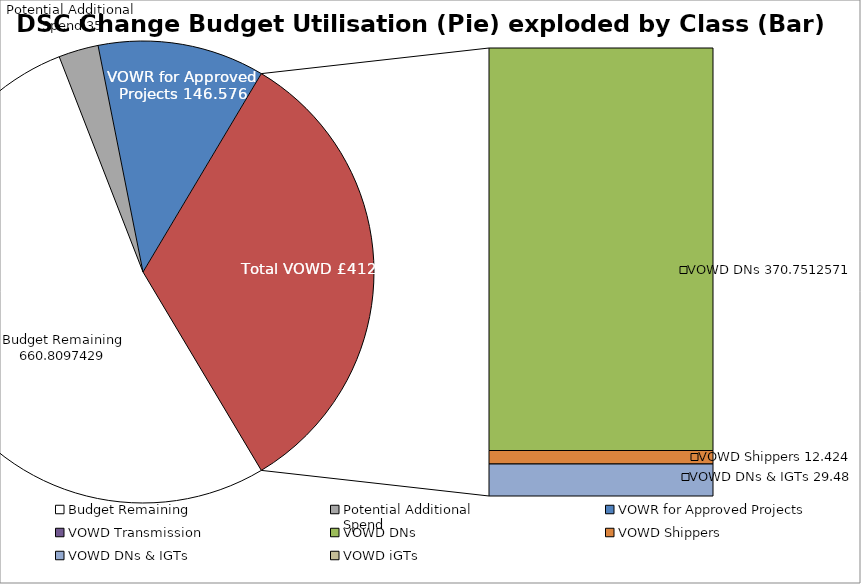
| Category | Series 0 |
|---|---|
| Budget Remaining | 660.81 |
| Potential Additional 
Spend | 35 |
| VOWR for Approved Projects | 146.576 |
| VOWD Transmission | 0 |
| VOWD DNs | 370.751 |
| VOWD Shippers | 12.424 |
| VOWD DNs & IGTs | 29.48 |
| VOWD iGTs | 0 |